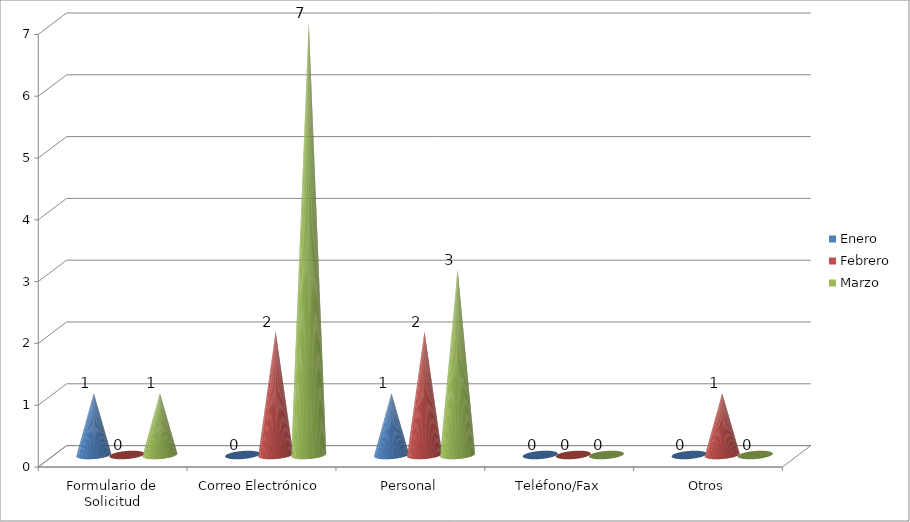
| Category | Enero | Febrero | Marzo |
|---|---|---|---|
| Formulario de Solicitud | 1 | 0 | 1 |
| Correo Electrónico | 0 | 2 | 7 |
| Personal | 1 | 2 | 3 |
| Teléfono/Fax | 0 | 0 | 0 |
| Otros | 0 | 1 | 0 |